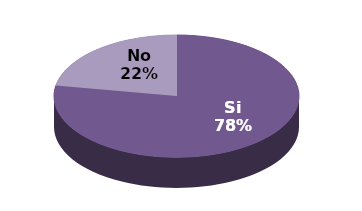
| Category | Series 1 | Series 0 |
|---|---|---|
| Si | 14 | 77.8 |
| No | 4 | 22.2 |